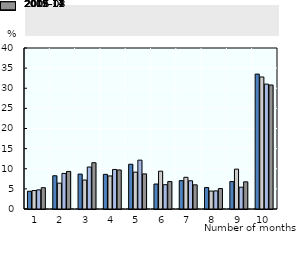
| Category | 2006-08 | 2009-11 | 2012-14 | 2015-17 |
|---|---|---|---|---|
| 1.0 | 4.409 | 4.587 | 4.755 | 5.292 |
| 2.0 | 8.261 | 6.426 | 8.841 | 9.332 |
| 3.0 | 8.676 | 7.19 | 10.43 | 11.491 |
| 4.0 | 8.614 | 8.213 | 9.826 | 9.699 |
| 5.0 | 11.118 | 9.16 | 12.139 | 8.722 |
| 6.0 | 6.203 | 9.392 | 6.04 | 6.824 |
| 7.0 | 7.049 | 7.874 | 7.016 | 6.004 |
| 8.0 | 5.333 | 4.455 | 4.501 | 5.082 |
| 9.0 | 6.818 | 9.906 | 5.419 | 6.751 |
| 10.0 | 33.519 | 32.798 | 31.032 | 30.803 |